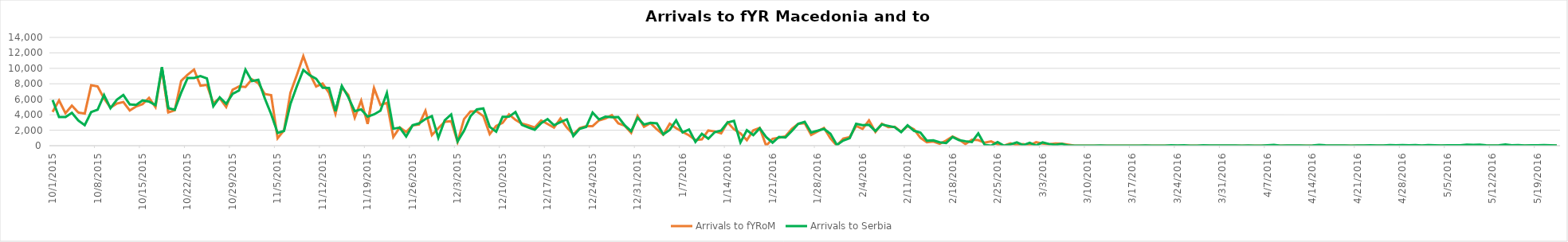
| Category | Arrivals to fYRoM | Arrivals to Serbia |
|---|---|---|
| 10/1/15 | 4370 | 5900 |
| 10/2/15 | 5853 | 3700 |
| 10/3/15 | 4202 | 3700 |
| 10/4/15 | 5181 | 4250 |
| 10/5/15 | 4282 | 3250 |
| 10/6/15 | 4156 | 2650 |
| 10/7/15 | 7816 | 4350 |
| 10/8/15 | 7663 | 4650 |
| 10/9/15 | 6107 | 6550 |
| 10/10/15 | 4922 | 4850 |
| 10/11/15 | 5448 | 5950 |
| 10/12/15 | 5645 | 6556 |
| 10/13/15 | 4551 | 5330 |
| 10/14/15 | 5073 | 5280 |
| 10/15/15 | 5373 | 5850 |
| 10/16/15 | 6181 | 5700 |
| 10/17/15 | 4988 | 5250 |
| 10/18/15 | 10005 | 10150 |
| 10/19/15 | 4299 | 4850 |
| 10/20/15 | 4584 | 4650 |
| 10/21/15 | 8384 | 6850 |
| 10/22/15 | 9174 | 8750 |
| 10/23/15 | 9840 | 8750 |
| 10/24/15 | 7752 | 9000 |
| 10/25/15 | 7864 | 8700 |
| 10/26/15 | 5500 | 5100 |
| 10/27/15 | 6146 | 6257 |
| 10/28/15 | 5000 | 5415 |
| 10/29/15 | 7231 | 6700 |
| 10/30/15 | 7663 | 7138 |
| 10/31/15 | 7590 | 9834 |
| 11/1/15 | 8584 | 8354 |
| 11/2/15 | 8075 | 8521 |
| 11/3/15 | 6682 | 6129 |
| 11/4/15 | 6532 | 4073 |
| 11/5/15 | 960 | 1652 |
| 11/6/15 | 1987 | 1906 |
| 11/7/15 | 6847 | 5397 |
| 11/8/15 | 9148 | 7695 |
| 11/9/15 | 11572 | 9785 |
| 11/10/15 | 9305 | 9107 |
| 11/11/15 | 7651 | 8648 |
| 11/12/15 | 8038 | 7500 |
| 11/13/15 | 6826 | 7464 |
| 11/14/15 | 4107 | 4453 |
| 11/15/15 | 7511 | 7734 |
| 11/16/15 | 6557 | 6267 |
| 11/17/15 | 3621 | 4460 |
| 11/18/15 | 5831 | 4694 |
| 11/19/15 | 2816 | 3765 |
| 11/20/15 | 7453 | 4042 |
| 11/21/15 | 5255 | 4527 |
| 11/22/15 | 5539 | 6826 |
| 11/23/15 | 1113 | 2201 |
| 11/24/15 | 2347 | 2335 |
| 11/25/15 | 1779 | 1194 |
| 11/26/15 | 2617 | 2636 |
| 11/27/15 | 2744 | 2878 |
| 11/28/15 | 4520 | 3454 |
| 11/29/15 | 1373 | 3825 |
| 11/30/15 | 2270 | 1009 |
| 12/1/15 | 3094 | 3284 |
| 12/2/15 | 3174 | 4040 |
| 12/3/15 | 494 | 553 |
| 12/4/15 | 3436 | 1927 |
| 12/5/15 | 4430 | 3799 |
| 12/6/15 | 4425 | 4686 |
| 12/7/15 | 3826 | 4823 |
| 12/8/15 | 1508 | 2437 |
| 12/9/15 | 2550 | 1807 |
| 12/10/15 | 2956 | 3723 |
| 12/11/15 | 4047 | 3747 |
| 12/12/15 | 3338 | 4339 |
| 12/13/15 | 2849 | 2698 |
| 12/14/15 | 2644 | 2353 |
| 12/15/15 | 2349 | 2067 |
| 12/16/15 | 3264 | 2916 |
| 12/17/15 | 2801 | 3438 |
| 12/18/15 | 2332 | 2649 |
| 12/19/15 | 3515 | 3052 |
| 12/20/15 | 2338 | 3405 |
| 12/21/15 | 1470 | 1253 |
| 12/22/15 | 2272 | 2186 |
| 12/23/15 | 2529 | 2415 |
| 12/24/15 | 2529 | 4279 |
| 12/25/15 | 3268 | 3390 |
| 12/26/15 | 3521 | 3757 |
| 12/27/15 | 3938 | 3674 |
| 12/28/15 | 2884 | 3708 |
| 12/29/15 | 2577 | 2629 |
| 12/30/15 | 1665 | 1879 |
| 12/31/15 | 3848 | 3602 |
| 1/1/16 | 2454 | 2745 |
| 1/2/16 | 2918 | 2947 |
| 1/3/16 | 2112 | 2889 |
| 1/4/16 | 1415 | 1462 |
| 1/5/16 | 2842 | 2041 |
| 1/6/16 | 2258 | 3273 |
| 1/7/16 | 1776 | 1715 |
| 1/8/16 | 1344 | 2100 |
| 1/9/16 | 715 | 489 |
| 1/10/16 | 819 | 1538 |
| 1/11/16 | 1959 | 905 |
| 1/12/16 | 1840 | 1743 |
| 1/13/16 | 1600 | 1973 |
| 1/14/16 | 3022 | 3006 |
| 1/15/16 | 2119 | 3213 |
| 1/16/16 | 1598 | 415 |
| 1/17/16 | 720 | 1995 |
| 1/18/16 | 1980 | 1362 |
| 1/19/16 | 2298 | 2244 |
| 1/20/16 | 0 | 1113 |
| 1/21/16 | 892 | 397 |
| 1/22/16 | 1030 | 1134 |
| 1/23/16 | 1208 | 1064 |
| 1/24/16 | 2174 | 1895 |
| 1/25/16 | 2836 | 2827 |
| 1/26/16 | 2908 | 3091 |
| 1/27/16 | 1402 | 1695 |
| 1/28/16 | 1837 | 1940 |
| 1/29/16 | 2292 | 2167 |
| 1/30/16 | 931 | 1540 |
| 1/31/16 | 0 | 103 |
| 2/1/16 | 908 | 660 |
| 2/2/16 | 1121 | 966 |
| 2/3/16 | 2558 | 2825 |
| 2/4/16 | 2173 | 2653 |
| 2/5/16 | 3259 | 2694 |
| 2/6/16 | 1780 | 1901 |
| 2/7/16 | 2838 | 2739 |
| 2/8/16 | 2392 | 2563 |
| 2/9/16 | 2441 | 2379 |
| 2/10/16 | 1817 | 1758 |
| 2/11/16 | 2540 | 2636 |
| 2/12/16 | 2115 | 1923 |
| 2/13/16 | 1019 | 1699 |
| 2/14/16 | 452 | 641 |
| 2/15/16 | 542 | 691 |
| 2/16/16 | 234 | 443 |
| 2/17/16 | 668 | 345 |
| 2/18/16 | 1200 | 1117 |
| 2/19/16 | 799 | 713 |
| 2/20/16 | 209 | 580 |
| 2/21/16 | 774 | 476 |
| 2/22/16 | 714 | 1595 |
| 2/23/16 | 382 | 106 |
| 2/24/16 | 551 | 1 |
| 2/25/16 | 168 | 475 |
| 2/26/16 | 20 | 0 |
| 2/27/16 | 310 | 158 |
| 2/28/16 | 92 | 431 |
| 2/29/16 | 208 | 69 |
| 3/1/16 | 30 | 372 |
| 3/2/16 | 457 | 16 |
| 3/3/16 | 269 | 428 |
| 3/4/16 | 177 | 218 |
| 3/5/16 | 293 | 115 |
| 3/6/16 | 261 | 236 |
| 3/7/16 | 127 | 14 |
| 3/8/16 | 0 | 0 |
| 3/9/16 | 0 | 3 |
| 3/10/16 | 0 | 0 |
| 3/11/16 | 0 | 0 |
| 3/12/16 | 0 | 35 |
| 3/13/16 | 0 | 12 |
| 3/14/16 | 0 | 0 |
| 3/15/16 | 0 | 0 |
| 3/16/16 | 0 | 0 |
| 3/17/16 | 0 | 0 |
| 3/18/16 | 0 | 0 |
| 3/19/16 | 0 | 30 |
| 3/20/16 | 0 | 0 |
| 3/21/16 | 0 | 0 |
| 3/22/16 | 0 | 0 |
| 3/23/16 | 0 | 49 |
| 3/24/16 | 0 | 31 |
| 3/25/16 | 0 | 40 |
| 3/26/16 | 0 | 0 |
| 3/27/16 | 0 | 4 |
| 3/28/16 | 0 | 42 |
| 3/29/16 | 0 | 37 |
| 3/30/16 | 0 | 21 |
| 3/31/16 | 0 | 14 |
| 4/1/16 | 0 | 28 |
| 4/2/16 | 0 | 32 |
| 4/3/16 | 0 | 10 |
| 4/4/16 | 0 | 28 |
| 4/5/16 | 0 | 0 |
| 4/6/16 | 0 | 4 |
| 4/7/16 | 0 | 58 |
| 4/8/16 | 0 | 93 |
| 4/9/16 | 0 | 8 |
| 4/10/16 | 0 | 30 |
| 4/11/16 | 0 | 34 |
| 4/12/16 | 0 | 22 |
| 4/13/16 | 0 | 3 |
| 4/14/16 | 0 | 34 |
| 4/15/16 | 0 | 90 |
| 4/16/16 | 0 | 41 |
| 4/17/16 | 0 | 15 |
| 4/18/16 | 0 | 17 |
| 4/19/16 | 0 | 34 |
| 4/20/16 | 0 | 5 |
| 4/21/16 | 0 | 31 |
| 4/22/16 | 0 | 19 |
| 4/23/16 | 0 | 45 |
| 4/24/16 | 0 | 38 |
| 4/25/16 | 0 | 34 |
| 4/26/16 | 0 | 73 |
| 4/27/16 | 0 | 54 |
| 4/28/16 | 0 | 69 |
| 4/29/16 | 0 | 59 |
| 4/30/16 | 0 | 80 |
| 5/1/16 | 0 | 26 |
| 5/2/16 | 0 | 81 |
| 5/3/16 | 0 | 50 |
| 5/4/16 | 0 | 25 |
| 5/5/16 | 0 | 58 |
| 5/6/16 | 0 | 49 |
| 5/7/16 | 0 | 59 |
| 5/8/16 | 0 | 128 |
| 5/9/16 | 0 | 113 |
| 5/10/16 | 0 | 119 |
| 5/11/16 | 0 | 62 |
| 5/12/16 | 0 | 33 |
| 5/13/16 | 0 | 51 |
| 5/14/16 | 0 | 161 |
| 5/15/16 | 0 | 45 |
| 5/16/16 | 0 | 71 |
| 5/17/16 | 0 | 17 |
| 5/18/16 | 0 | 44 |
| 5/19/16 | 0 | 55 |
| 5/20/16 | 0 | 74 |
| 5/21/16 | 0 | 39 |
| 5/22/16 | 0 | 16 |